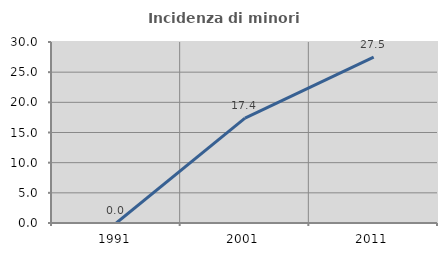
| Category | Incidenza di minori stranieri |
|---|---|
| 1991.0 | 0 |
| 2001.0 | 17.391 |
| 2011.0 | 27.5 |